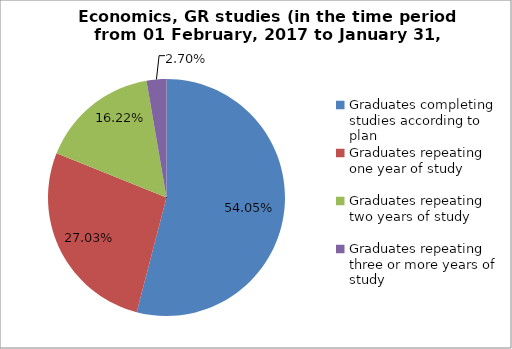
| Category | Series 0 |
|---|---|
| Graduates completing studies according to plan | 54.054 |
| Graduates repeating one year of study | 27.027 |
| Graduates repeating two years of study | 16.216 |
| Graduates repeating three or more years of study | 2.703 |